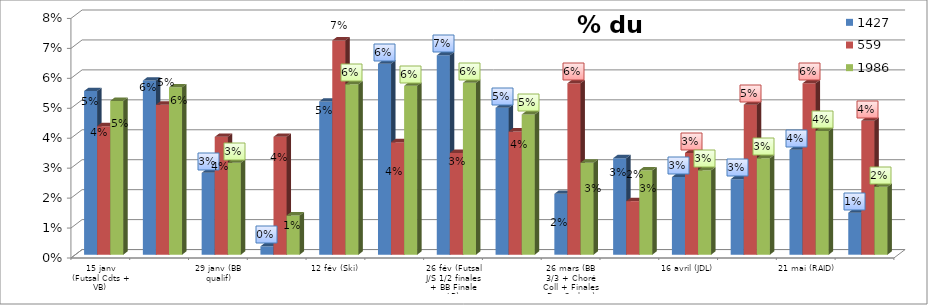
| Category | 1427 | 559 | 1986 |
|---|---|---|---|
| 15 janv (Futsal Cdts + VB) | 0.055 | 0.043 | 0.051 |
| 22 janv (Futsal J/S + Bad + Escalade + Arbitrage BB) | 0.058 | 0.05 | 0.056 |
| 29 janv (BB qualif) | 0.027 | 0.039 | 0.031 |
| 5 fév (Futsal Filles + Championnats Dépt) | 0.003 | 0.039 | 0.013 |
| 12 fév (Ski) | 0.051 | 0.072 | 0.057 |
| 19 fév (Futsal Cadets 1/2 finales + Choré Collective) | 0.064 | 0.038 | 0.056 |
| 26 fév (Futsal J/S 1/2 finales + BB Finale LP) | 0.067 | 0.034 | 0.057 |
| 19 mars (Futsal filles + Cadets Finale LP + Bad de ptps) | 0.049 | 0.041 | 0.047 |
| 26 mars (BB 3/3 + Choré Coll + Finales Dpt Cadets) | 0.02 | 0.057 | 0.031 |
| 02 avril (Futsal Finale District J/S + VB) | 0.032 | 0.018 | 0.028 |
| 16 avril (JDL) | 0.026 | 0.034 | 0.028 |
| 23 avril (ESCALADE + Foot à 7) | 0.025 | 0.05 | 0.032 |
| 21 mai (RAID) | 0.035 | 0.057 | 0.041 |
| 28 mai (HANDISPORT) | 0.014 | 0.045 | 0.023 |